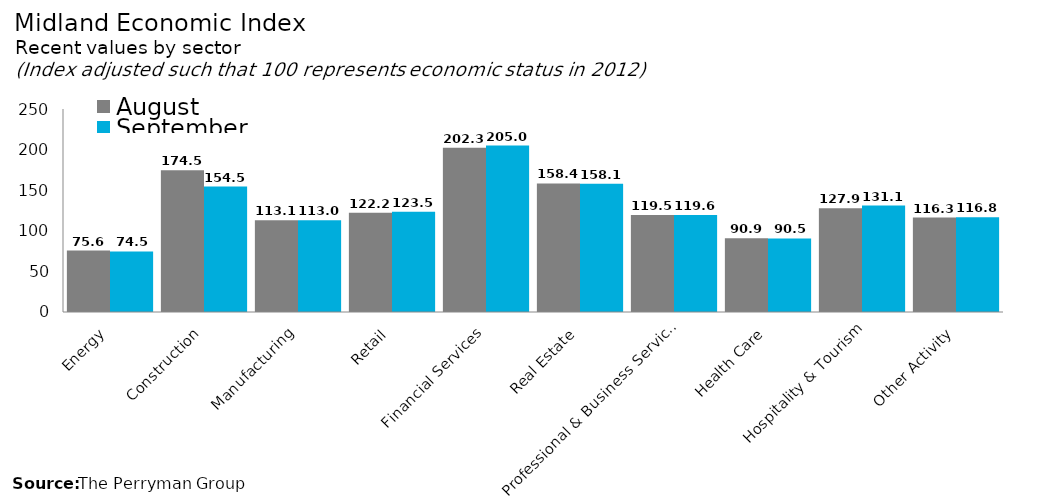
| Category | August | September |
|---|---|---|
| Energy | 75.621 | 74.515 |
| Construction | 174.526 | 154.465 |
| Manufacturing | 113.098 | 113.011 |
| Retail | 122.211 | 123.536 |
| Financial Services | 202.315 | 205.022 |
| Real Estate | 158.393 | 158.057 |
| Professional & Business Services | 119.531 | 119.596 |
| Health Care | 90.882 | 90.522 |
| Hospitality & Tourism | 127.87 | 131.101 |
| Other Activity | 116.327 | 116.797 |